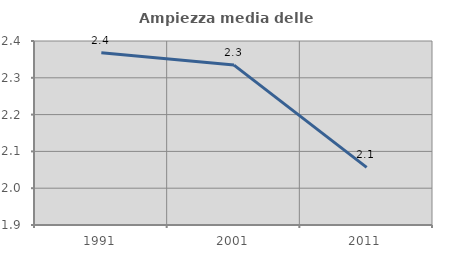
| Category | Ampiezza media delle famiglie |
|---|---|
| 1991.0 | 2.368 |
| 2001.0 | 2.334 |
| 2011.0 | 2.057 |